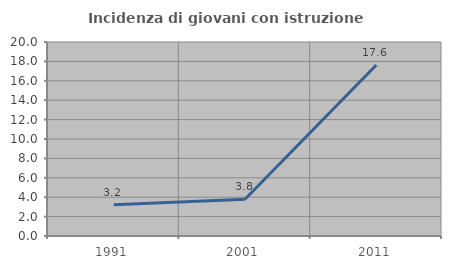
| Category | Incidenza di giovani con istruzione universitaria |
|---|---|
| 1991.0 | 3.233 |
| 2001.0 | 3.782 |
| 2011.0 | 17.634 |